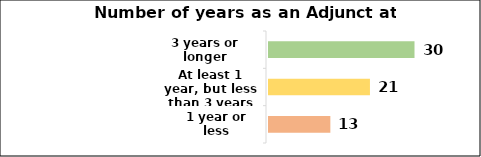
| Category | Series 0 |
|---|---|
| 1 year or less | 13 |
| At least 1 year, but less than 3 years | 21 |
| 3 years or longer | 30 |